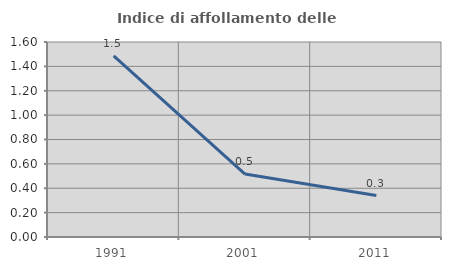
| Category | Indice di affollamento delle abitazioni  |
|---|---|
| 1991.0 | 1.487 |
| 2001.0 | 0.516 |
| 2011.0 | 0.34 |